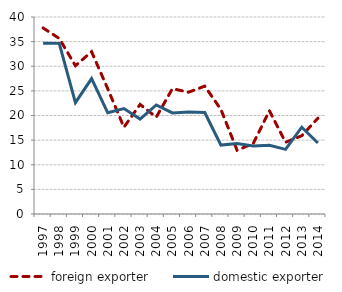
| Category | foreign exporter | domestic exporter |
|---|---|---|
| 1997.0 | 37.778 | 34.691 |
| 1998.0 | 35.646 | 34.648 |
| 1999.0 | 30.106 | 22.621 |
| 2000.0 | 32.952 | 27.5 |
| 2001.0 | 25.427 | 20.547 |
| 2002.0 | 17.621 | 21.406 |
| 2003.0 | 22.246 | 19.265 |
| 2004.0 | 19.656 | 22.148 |
| 2005.0 | 25.451 | 20.519 |
| 2006.0 | 24.727 | 20.721 |
| 2007.0 | 25.962 | 20.603 |
| 2008.0 | 21.232 | 14 |
| 2009.0 | 12.948 | 14.297 |
| 2010.0 | 14.317 | 13.806 |
| 2011.0 | 20.958 | 13.946 |
| 2012.0 | 14.563 | 13.127 |
| 2013.0 | 15.888 | 17.628 |
| 2014.0 | 19.455 | 14.421 |